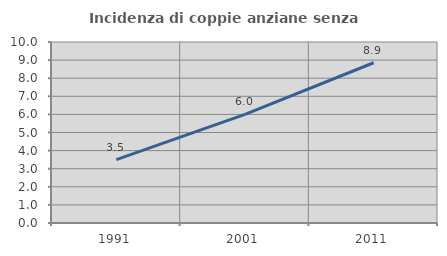
| Category | Incidenza di coppie anziane senza figli  |
|---|---|
| 1991.0 | 3.502 |
| 2001.0 | 6 |
| 2011.0 | 8.853 |